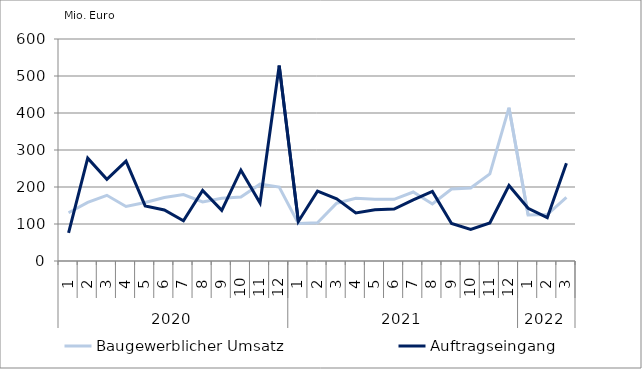
| Category | Baugewerblicher Umsatz | Auftragseingang |
|---|---|---|
| 0 | 130445.562 | 75891.481 |
| 1 | 158433.655 | 277923.85 |
| 2 | 177529.832 | 220973.626 |
| 3 | 147259.799 | 269936.091 |
| 4 | 157965.891 | 149072.895 |
| 5 | 171647.778 | 137984.76 |
| 6 | 179530.732 | 108645.965 |
| 7 | 159480.457 | 190771.468 |
| 8 | 169638.111 | 136988.906 |
| 9 | 173040.053 | 245341.603 |
| 10 | 207619.085 | 156647.224 |
| 11 | 199947.086 | 528166.004 |
| 12 | 101295.895 | 106850.127 |
| 13 | 103236.543 | 188883.434 |
| 14 | 156172.725 | 168204.42 |
| 15 | 169257.088 | 130052.073 |
| 16 | 166897.821 | 138492.214 |
| 17 | 166720.216 | 140262.426 |
| 18 | 186515.191 | 165331.191 |
| 19 | 154188.941 | 188169.655 |
| 20 | 194464.12 | 101359.538 |
| 21 | 197281.201 | 85626.862 |
| 22 | 235325.083 | 102880.924 |
| 23 | 414469.471 | 203900.676 |
| 24 | 124217.549 | 142351.759 |
| 25 | 125619.696 | 117194.423 |
| 26 | 171896.664 | 264509.013 |